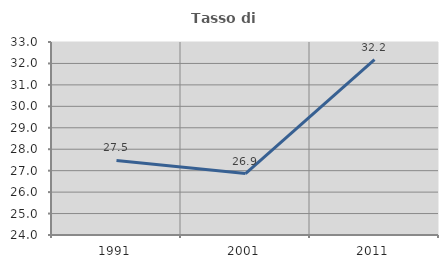
| Category | Tasso di occupazione   |
|---|---|
| 1991.0 | 27.478 |
| 2001.0 | 26.864 |
| 2011.0 | 32.178 |